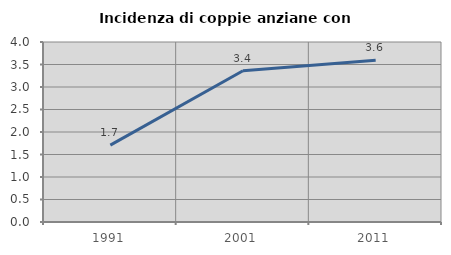
| Category | Incidenza di coppie anziane con figli |
|---|---|
| 1991.0 | 1.707 |
| 2001.0 | 3.361 |
| 2011.0 | 3.596 |